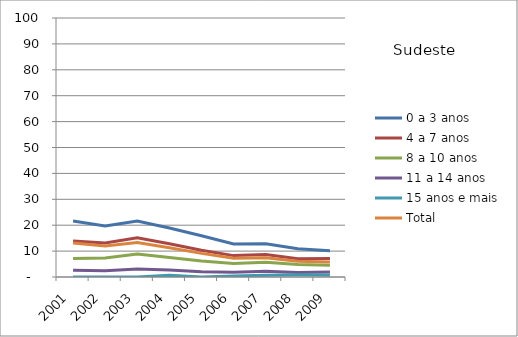
| Category | 0 a 3 anos | 4 a 7 anos | 8 a 10 anos | 11 a 14 anos | 15 anos e mais | Total |
|---|---|---|---|---|---|---|
| 2001.0 | 21.59 | 13.89 | 7.13 | 2.63 | 0 | 13.14 |
| 2002.0 | 19.72 | 13.13 | 7.37 | 2.46 | 0 | 12 |
| 2003.0 | 21.62 | 15.18 | 8.88 | 3.12 | 0 | 13.27 |
| 2004.0 | 18.9 | 12.86 | 7.57 | 2.69 | 0.63 | 11.32 |
| 2005.0 | 15.91 | 10.36 | 6.16 | 2.05 | 0 | 9.12 |
| 2006.0 | 12.76 | 8.26 | 5.25 | 1.86 | 0.4 | 7.23 |
| 2007.0 | 12.82 | 8.72 | 5.66 | 2.25 | 0.7 | 7.43 |
| 2008.0 | 10.88 | 7.04 | 4.81 | 1.75 | 0.83 | 6.1 |
| 2009.0 | 10.13 | 7.19 | 4.51 | 1.9 | 0.81 | 5.82 |